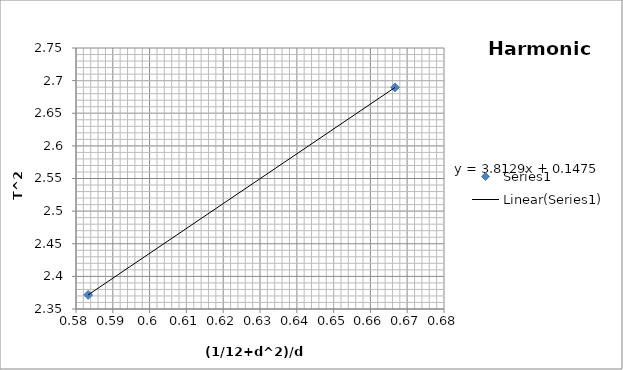
| Category | Series 0 |
|---|---|
| 0.5833 | 2.372 |
| 0.6667 | 2.69 |